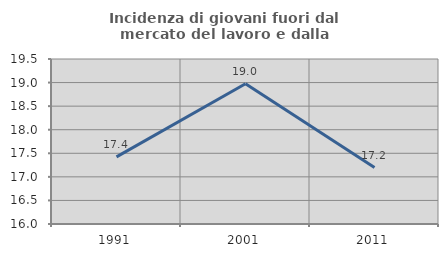
| Category | Incidenza di giovani fuori dal mercato del lavoro e dalla formazione  |
|---|---|
| 1991.0 | 17.424 |
| 2001.0 | 18.975 |
| 2011.0 | 17.197 |